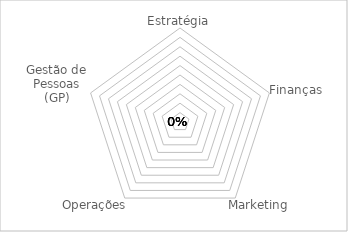
| Category | Pontuação mínima recomendada |
|---|---|
| Estratégia | 0 |
| Finanças | 0 |
| Marketing | 0 |
| Operações | 0 |
| Gestão de Pessoas (GP) | 0 |